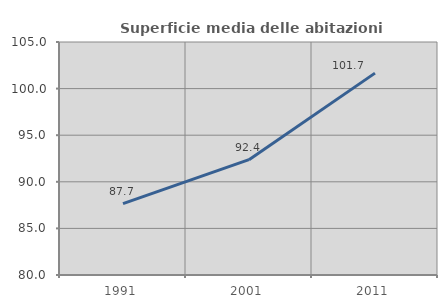
| Category | Superficie media delle abitazioni occupate |
|---|---|
| 1991.0 | 87.66 |
| 2001.0 | 92.376 |
| 2011.0 | 101.66 |